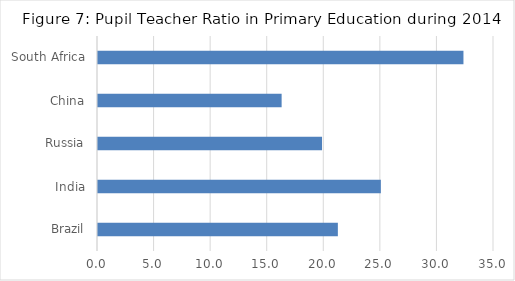
| Category | PTR |
|---|---|
| Brazil | 21.2 |
| India | 25 |
| Russia | 19.8 |
| China | 16.23 |
| South Africa | 32.3 |